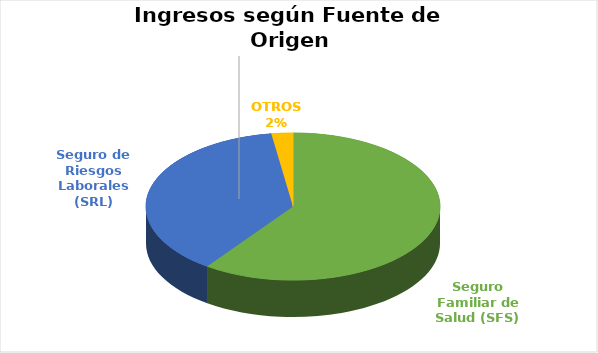
| Category | Series 0 |
|---|---|
| Seguro Familiar de Salud (SFS) | 522537850.16 |
| Seguro de Riesgos Laborales (SRL) | 329238376.01 |
| OTROS | 20558398.16 |